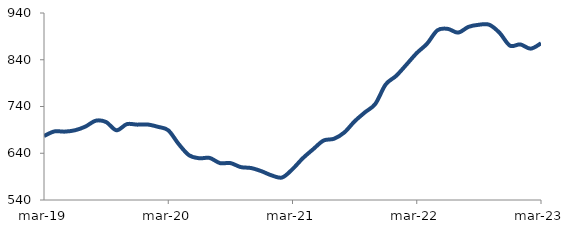
| Category | Series 0 |
|---|---|
| 2019-03-01 | 676.827 |
| 2019-04-01 | 686.669 |
| 2019-05-01 | 686.255 |
| 2019-06-01 | 689.181 |
| 2019-07-01 | 697.076 |
| 2019-08-01 | 709.635 |
| 2019-09-01 | 706.734 |
| 2019-10-01 | 689.137 |
| 2019-11-01 | 702.277 |
| 2019-12-01 | 701.214 |
| 2020-01-01 | 701.517 |
| 2020-02-01 | 696.552 |
| 2020-03-01 | 689.099 |
| 2020-04-01 | 659.896 |
| 2020-05-01 | 635.894 |
| 2020-06-01 | 629.29 |
| 2020-07-01 | 629.994 |
| 2020-08-01 | 618.866 |
| 2020-09-01 | 619.022 |
| 2020-10-01 | 610.428 |
| 2020-11-01 | 608.402 |
| 2020-12-01 | 601.605 |
| 2021-01-01 | 592.504 |
| 2021-02-01 | 588.185 |
| 2021-03-01 | 605.989 |
| 2021-04-01 | 629.446 |
| 2021-05-01 | 648.73 |
| 2021-06-01 | 667.177 |
| 2021-07-01 | 670.996 |
| 2021-08-01 | 684.389 |
| 2021-09-01 | 708.308 |
| 2021-10-01 | 727.608 |
| 2021-11-01 | 745.65 |
| 2021-12-01 | 787.184 |
| 2022-01-01 | 805.308 |
| 2022-02-01 | 829.502 |
| 2022-03-01 | 854.336 |
| 2022-04-01 | 874.453 |
| 2022-05-01 | 903.049 |
| 2022-06-01 | 906.022 |
| 2022-07-01 | 898.071 |
| 2022-08-01 | 910.353 |
| 2022-09-01 | 914.859 |
| 2022-10-01 | 914.857 |
| 2022-11-01 | 897.607 |
| 2022-12-01 | 870.196 |
| 2023-01-01 | 872.784 |
| 2023-02-01 | 863.736 |
| 2023-03-01 | 875.118 |